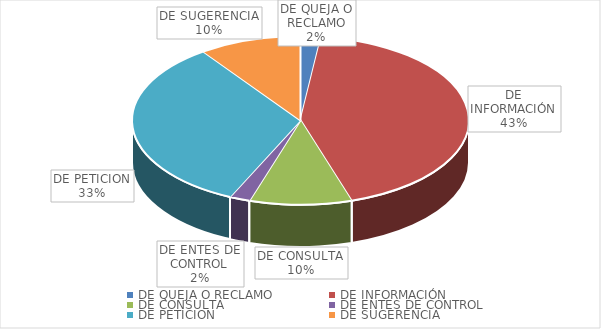
| Category | Series 0 |
|---|---|
| DE QUEJA O RECLAMO | 1 |
| DE INFORMACIÓN | 22 |
| DE CONSULTA | 5 |
| DE ENTES DE CONTROL | 1 |
| DE PETICION | 17 |
| DE SUGERENCIA | 5 |